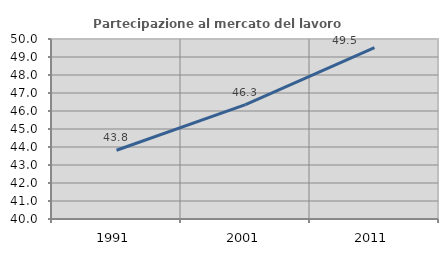
| Category | Partecipazione al mercato del lavoro  femminile |
|---|---|
| 1991.0 | 43.821 |
| 2001.0 | 46.35 |
| 2011.0 | 49.517 |